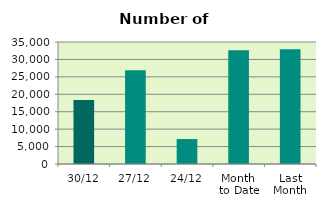
| Category | Series 0 |
|---|---|
| 30/12 | 18330 |
| 27/12 | 26904 |
| 24/12 | 7162 |
| Month 
to Date | 32623.368 |
| Last
Month | 32932.667 |